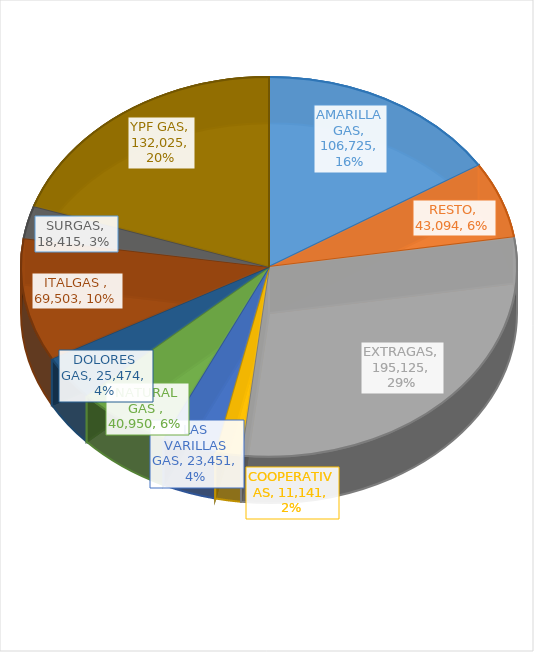
| Category | Series 0 |
|---|---|
| AMARILLA GAS | 106725.43 |
| RESTO | 43094.04 |
| EXTRAGAS | 195125.08 |
| COOPERATIVAS | 11140.5 |
| LAS VARILLAS GAS | 23450.86 |
| NATURAL GAS  | 40950.1 |
| DOLORES GAS | 25474.36 |
| ITALGAS  | 69503.47 |
| SURGAS | 18415.32 |
| YPF GAS | 132024.54 |